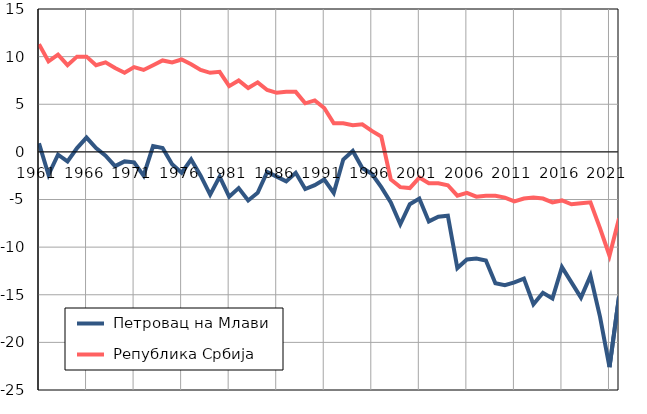
| Category |  Петровац на Млави |  Република Србија |
|---|---|---|
| 1961.0 | 0.9 | 11.3 |
| 1962.0 | -2.4 | 9.5 |
| 1963.0 | -0.3 | 10.2 |
| 1964.0 | -1 | 9.1 |
| 1965.0 | 0.4 | 10 |
| 1966.0 | 1.5 | 10 |
| 1967.0 | 0.4 | 9.1 |
| 1968.0 | -0.4 | 9.4 |
| 1969.0 | -1.5 | 8.8 |
| 1970.0 | -1 | 8.3 |
| 1971.0 | -1.1 | 8.9 |
| 1972.0 | -2.5 | 8.6 |
| 1973.0 | 0.6 | 9.1 |
| 1974.0 | 0.4 | 9.6 |
| 1975.0 | -1.3 | 9.4 |
| 1976.0 | -2.2 | 9.7 |
| 1977.0 | -0.8 | 9.2 |
| 1978.0 | -2.5 | 8.6 |
| 1979.0 | -4.5 | 8.3 |
| 1980.0 | -2.6 | 8.4 |
| 1981.0 | -4.7 | 6.9 |
| 1982.0 | -3.8 | 7.5 |
| 1983.0 | -5.1 | 6.7 |
| 1984.0 | -4.3 | 7.3 |
| 1985.0 | -2.1 | 6.5 |
| 1986.0 | -2.6 | 6.2 |
| 1987.0 | -3.1 | 6.3 |
| 1988.0 | -2.2 | 6.3 |
| 1989.0 | -3.9 | 5.1 |
| 1990.0 | -3.5 | 5.4 |
| 1991.0 | -2.9 | 4.6 |
| 1992.0 | -4.3 | 3 |
| 1993.0 | -0.8 | 3 |
| 1994.0 | 0.1 | 2.8 |
| 1995.0 | -1.7 | 2.9 |
| 1996.0 | -2.3 | 2.2 |
| 1997.0 | -3.7 | 1.6 |
| 1998.0 | -5.3 | -2.9 |
| 1999.0 | -7.6 | -3.7 |
| 2000.0 | -5.5 | -3.8 |
| 2001.0 | -4.9 | -2.7 |
| 2002.0 | -7.3 | -3.3 |
| 2003.0 | -6.8 | -3.3 |
| 2004.0 | -6.7 | -3.5 |
| 2005.0 | -12.2 | -4.6 |
| 2006.0 | -11.3 | -4.3 |
| 2007.0 | -11.2 | -4.7 |
| 2008.0 | -11.4 | -4.6 |
| 2009.0 | -13.8 | -4.6 |
| 2010.0 | -14 | -4.8 |
| 2011.0 | -13.7 | -5.2 |
| 2012.0 | -13.3 | -4.9 |
| 2013.0 | -16 | -4.8 |
| 2014.0 | -14.8 | -4.9 |
| 2015.0 | -15.4 | -5.3 |
| 2016.0 | -12.1 | -5.1 |
| 2017.0 | -13.7 | -5.5 |
| 2018.0 | -15.3 | -5.4 |
| 2019.0 | -13 | -5.3 |
| 2020.0 | -17.3 | -8 |
| 2021.0 | -22.6 | -10.9 |
| 2022.0 | -15.2 | -7 |